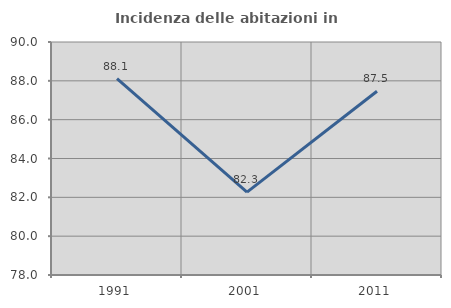
| Category | Incidenza delle abitazioni in proprietà  |
|---|---|
| 1991.0 | 88.108 |
| 2001.0 | 82.271 |
| 2011.0 | 87.462 |